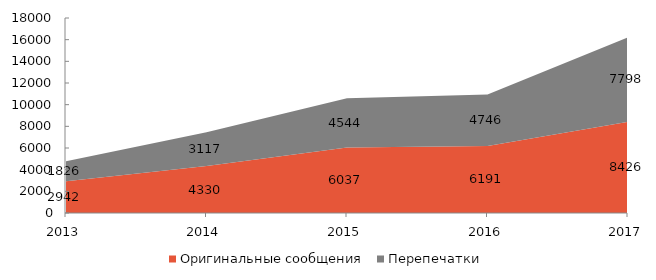
| Category | Оригинальные сообщения | Перепечатки |
|---|---|---|
| 2013 | 2942 | 1826 |
| 2014 | 4330 | 3117 |
| 2015 | 6037 | 4544 |
| 2016 | 6191 | 4746 |
| 2017 | 8426 | 7798 |